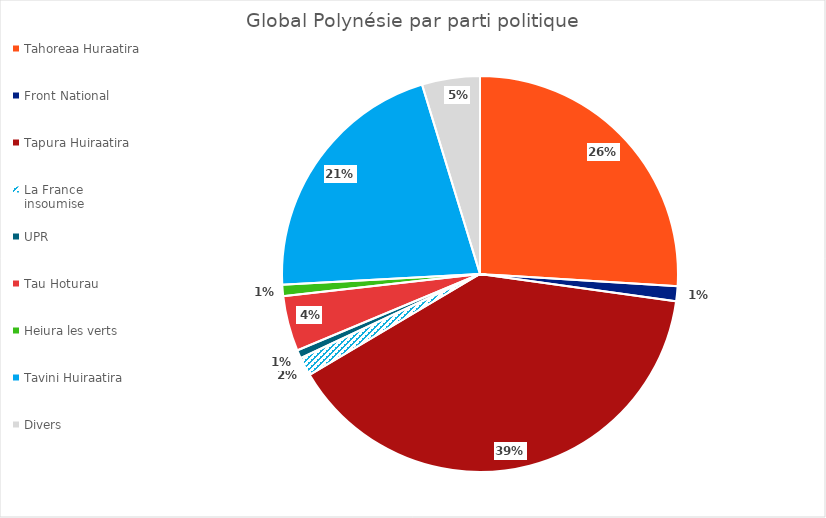
| Category | Global Polynésie |
|---|---|
| Tahoreaa Huraatira | 21762 |
| Front National | 1021 |
| Tapura Huiraatira | 32906 |
| La France insoumise | 1277 |
| UPR | 567 |
| Tau Hoturau | 3779 |
| Heiura les verts | 778 |
| Tavini Huiraatira | 17699 |
| Divers | 3958 |